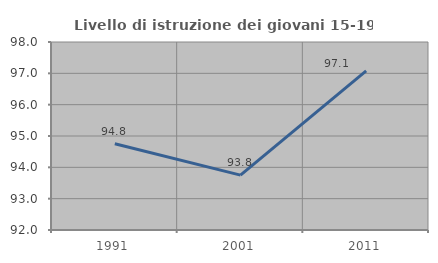
| Category | Livello di istruzione dei giovani 15-19 anni |
|---|---|
| 1991.0 | 94.751 |
| 2001.0 | 93.75 |
| 2011.0 | 97.076 |